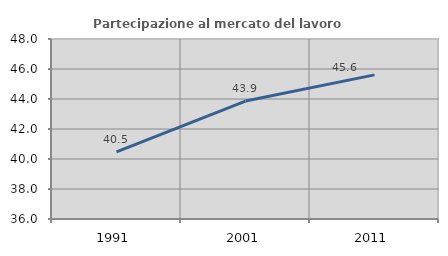
| Category | Partecipazione al mercato del lavoro  femminile |
|---|---|
| 1991.0 | 40.476 |
| 2001.0 | 43.862 |
| 2011.0 | 45.607 |